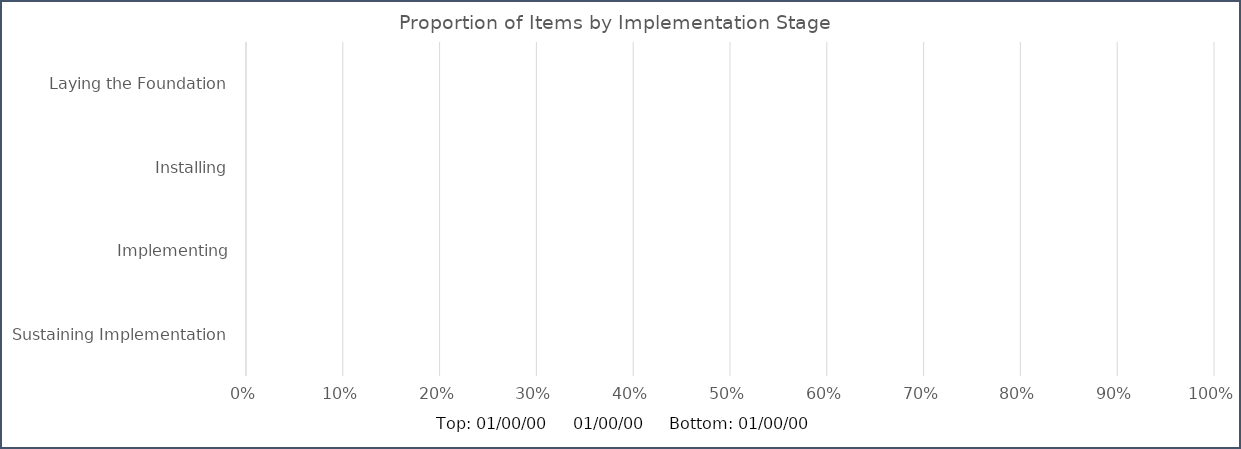
| Category | Top: 01/00/00 | 01/00/00 | Bottom: 01/00/00 |
|---|---|---|---|
| Laying the Foundation | 0 | 0 | 0 |
| Installing | 0 | 0 | 0 |
| Implementing | 0 | 0 | 0 |
| Sustaining Implementation | 0 | 0 | 0 |